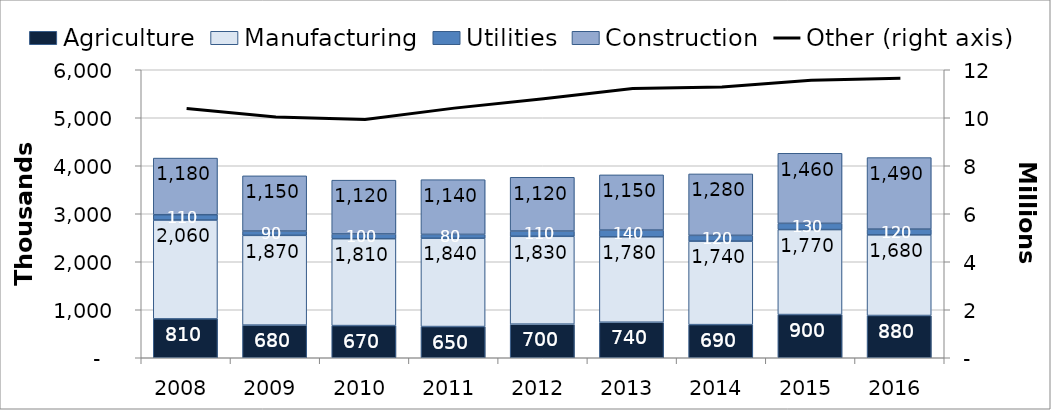
| Category | Agriculture | Manufacturing | Utilities | Construction |
|---|---|---|---|---|
| 2008.0 | 810 | 2060 | 110 | 1180 |
| 2009.0 | 680 | 1870 | 90 | 1150 |
| 2010.0 | 670 | 1810 | 100 | 1120 |
| 2011.0 | 650 | 1840 | 80 | 1140 |
| 2012.0 | 700 | 1830 | 110 | 1120 |
| 2013.0 | 740 | 1780 | 140 | 1150 |
| 2014.0 | 690 | 1740 | 120 | 1280 |
| 2015.0 | 900 | 1770 | 130 | 1460 |
| 2016.0 | 880 | 1680 | 120 | 1490 |